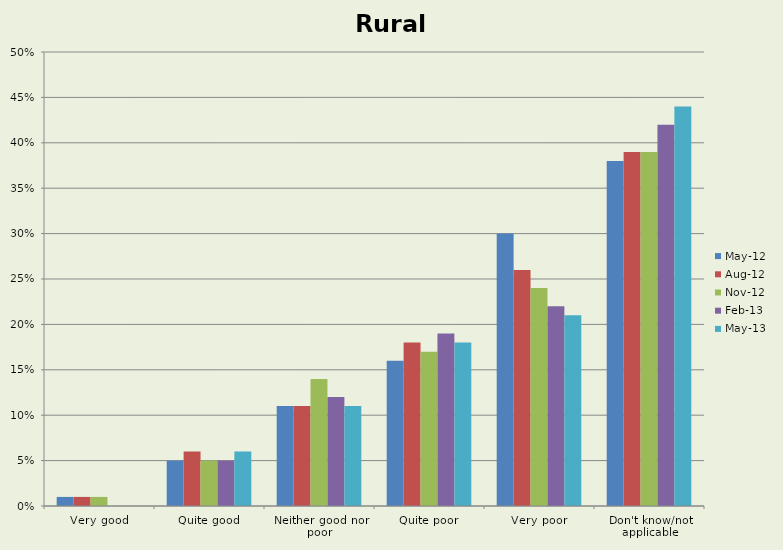
| Category | May-12 | Aug-12 | Nov-12 | Feb-13 | May-13 |
|---|---|---|---|---|---|
| Very good | 0.01 | 0.01 | 0.01 | 0 | 0 |
| Quite good | 0.05 | 0.06 | 0.05 | 0.05 | 0.06 |
| Neither good nor poor | 0.11 | 0.11 | 0.14 | 0.12 | 0.11 |
| Quite poor | 0.16 | 0.18 | 0.17 | 0.19 | 0.18 |
| Very poor | 0.3 | 0.26 | 0.24 | 0.22 | 0.21 |
| Don't know/not applicable | 0.38 | 0.39 | 0.39 | 0.42 | 0.44 |